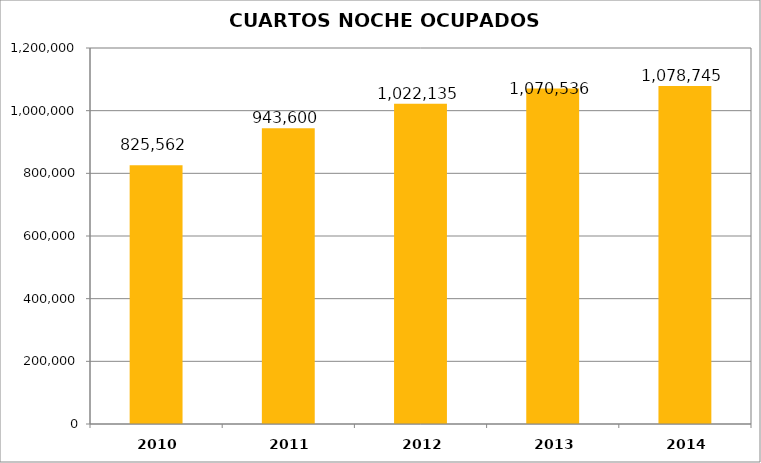
| Category | CUARTOS NOCHE OCUPADOS MENSUAL |
|---|---|
| 2010.0 | 825562 |
| 2011.0 | 943600 |
| 2012.0 | 1022135 |
| 2013.0 | 1070536 |
| 2014.0 | 1078745 |